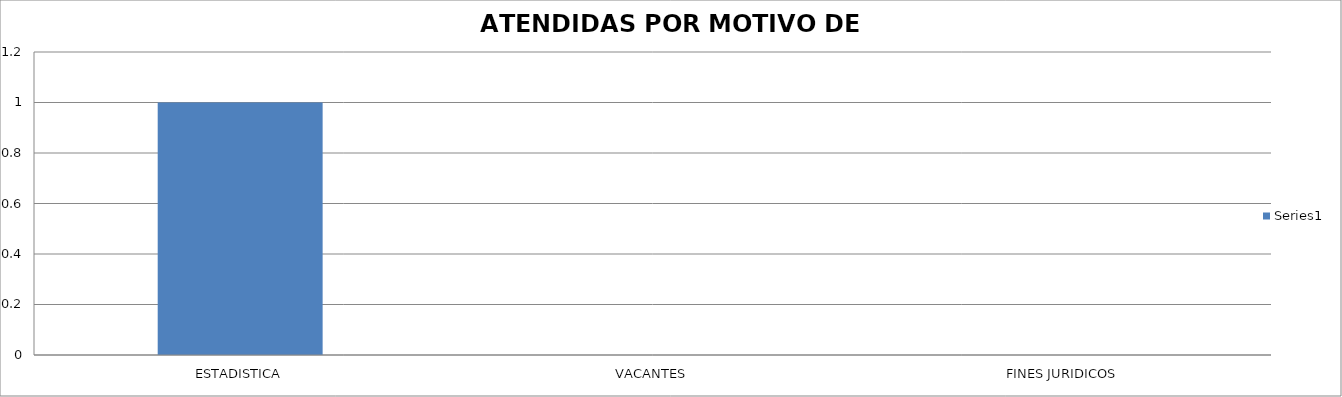
| Category | Series 0 |
|---|---|
| ESTADISTICA | 1 |
| VACANTES | 0 |
| FINES JURIDICOS | 0 |